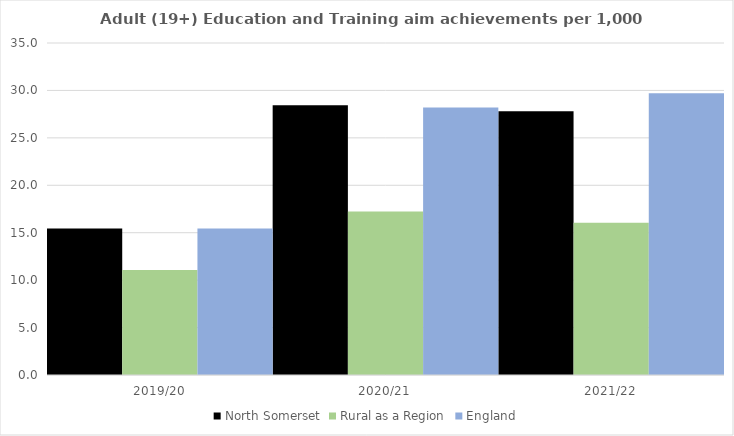
| Category | North Somerset | Rural as a Region | England |
|---|---|---|---|
| 2019/20 | 15.433 | 11.081 | 15.446 |
| 2020/21 | 28.426 | 17.224 | 28.211 |
| 2021/22 | 27.818 | 16.063 | 29.711 |